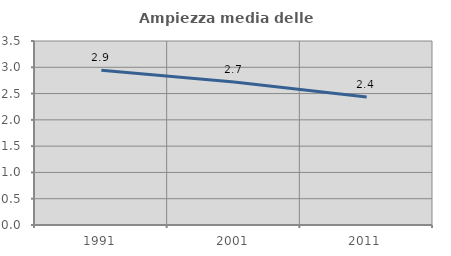
| Category | Ampiezza media delle famiglie |
|---|---|
| 1991.0 | 2.942 |
| 2001.0 | 2.722 |
| 2011.0 | 2.435 |